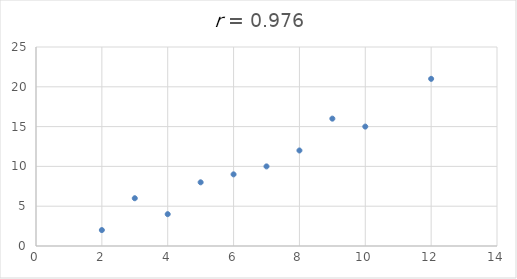
| Category | Series 0 |
|---|---|
| 2.0 | 2 |
| 4.0 | 4 |
| 7.0 | 10 |
| 5.0 | 8 |
| 8.0 | 12 |
| 6.0 | 9 |
| 9.0 | 16 |
| 12.0 | 21 |
| 3.0 | 6 |
| 10.0 | 15 |